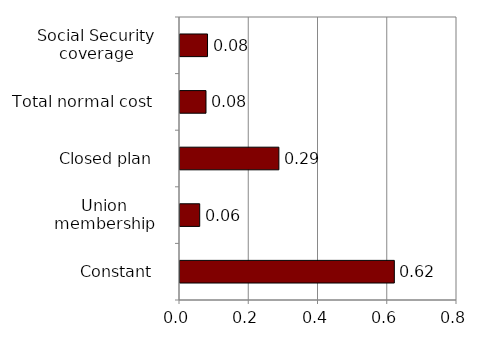
| Category | Series 0 |
|---|---|
| Constant | 0.619 |
| Union membership | 0.057 |
| Closed plan | 0.286 |
| Total normal cost | 0.075 |
| Social Security coverage | 0.079 |